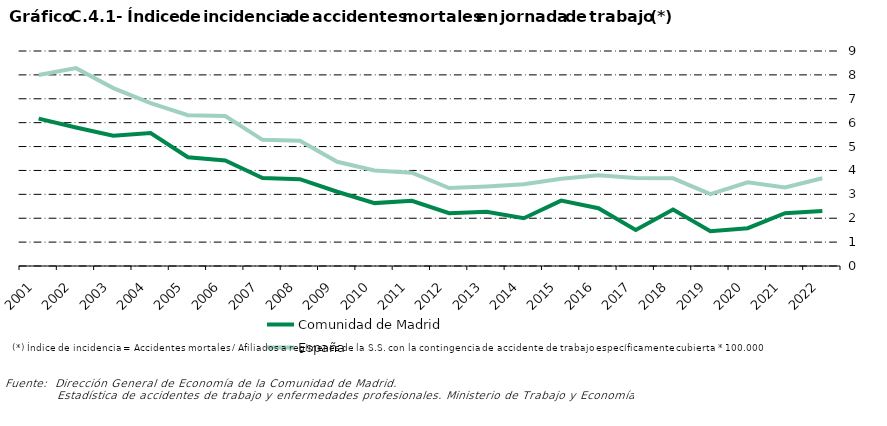
| Category | Comunidad de Madrid | España |
|---|---|---|
| 2001.0 | 6.171 | 7.997 |
| 2002.0 | 5.796 | 8.282 |
| 2003.0 | 5.454 | 7.447 |
| 2004.0 | 5.566 | 6.814 |
| 2005.0 | 4.553 | 6.31 |
| 2006.0 | 4.42 | 6.28 |
| 2007.0 | 3.68 | 5.28 |
| 2008.0 | 3.636 | 5.243 |
| 2009.0 | 3.109 | 4.364 |
| 2010.0 | 2.633 | 3.996 |
| 2011.0 | 2.727 | 3.906 |
| 2012.0 | 2.212 | 3.263 |
| 2013.0 | 2.274 | 3.327 |
| 2014.0 | 1.998 | 3.422 |
| 2015.0 | 2.738 | 3.657 |
| 2016.0 | 2.42 | 3.797 |
| 2017.0 | 1.508 | 3.686 |
| 2018.0 | 2.364 | 3.671 |
| 2019.0 | 1.459 | 3.01 |
| 2020.0 | 1.584 | 3.505 |
| 2021.0 | 2.212 | 3.284 |
| 2022.0 | 2.3 | 3.672 |